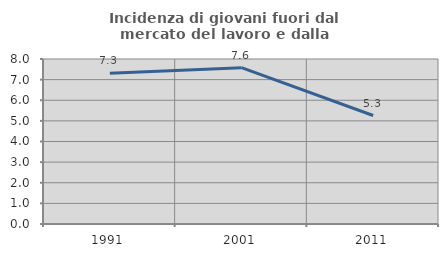
| Category | Incidenza di giovani fuori dal mercato del lavoro e dalla formazione  |
|---|---|
| 1991.0 | 7.308 |
| 2001.0 | 7.579 |
| 2011.0 | 5.26 |